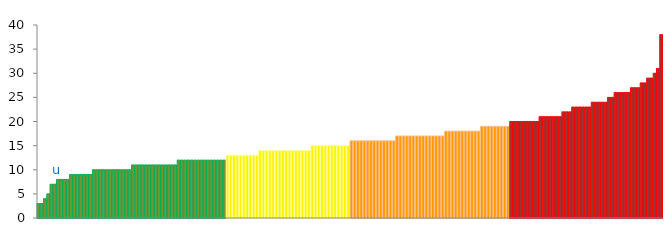
| Category | Top Quartile | 2nd Quartile | 3rd Quartile | Bottom Quartile | Series 4 |
|---|---|---|---|---|---|
|  | 3 | 0 | 0 | 0 | 3 |
|  | 3 | 0 | 0 | 0 | 3 |
|  | 4 | 0 | 0 | 0 | 4 |
|  | 5 | 0 | 0 | 0 | 5 |
|  | 7 | 0 | 0 | 0 | 7 |
|  | 7 | 0 | 0 | 0 | 7 |
| u | 8 | 0 | 0 | 0 | 8 |